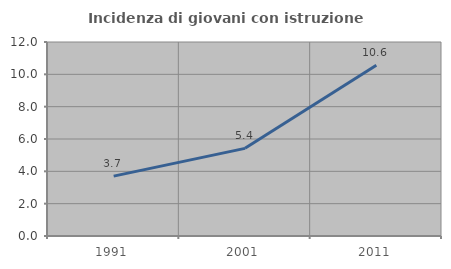
| Category | Incidenza di giovani con istruzione universitaria |
|---|---|
| 1991.0 | 3.704 |
| 2001.0 | 5.422 |
| 2011.0 | 10.556 |